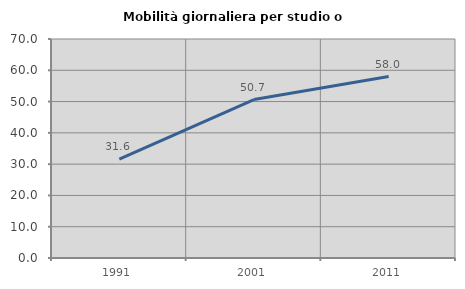
| Category | Mobilità giornaliera per studio o lavoro |
|---|---|
| 1991.0 | 31.595 |
| 2001.0 | 50.653 |
| 2011.0 | 58.01 |